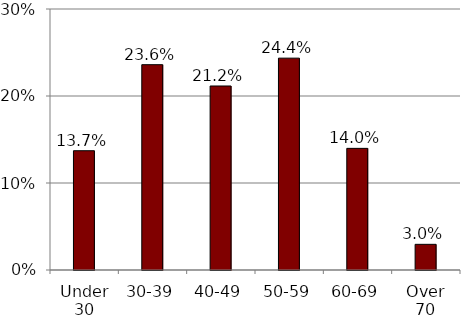
| Category | Series 0 |
|---|---|
| Under 30 | 0.137 |
| 30-39 | 0.236 |
| 40-49 | 0.212 |
| 50-59 | 0.244 |
| 60-69 | 0.14 |
| Over 70 | 0.03 |